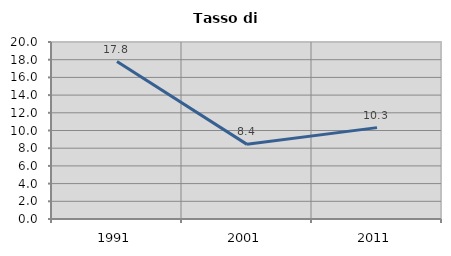
| Category | Tasso di disoccupazione   |
|---|---|
| 1991.0 | 17.788 |
| 2001.0 | 8.434 |
| 2011.0 | 10.326 |